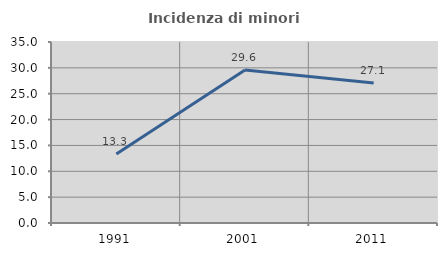
| Category | Incidenza di minori stranieri |
|---|---|
| 1991.0 | 13.333 |
| 2001.0 | 29.6 |
| 2011.0 | 27.081 |